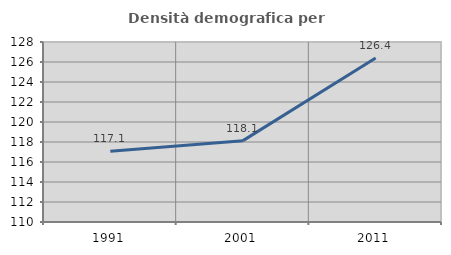
| Category | Densità demografica |
|---|---|
| 1991.0 | 117.076 |
| 2001.0 | 118.136 |
| 2011.0 | 126.391 |